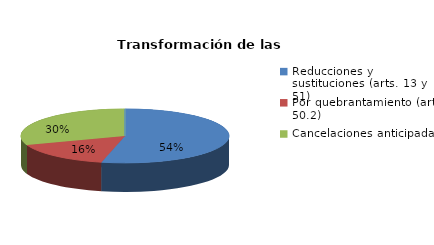
| Category | Series 0 |
|---|---|
| Reducciones y sustituciones (arts. 13 y 51) | 37 |
| Por quebrantamiento (art. 50.2) | 11 |
| Cancelaciones anticipadas | 21 |
| Traslado a Centros Penitenciarios | 0 |
| Conversión internamientos en cerrados (art. 51.2) | 0 |